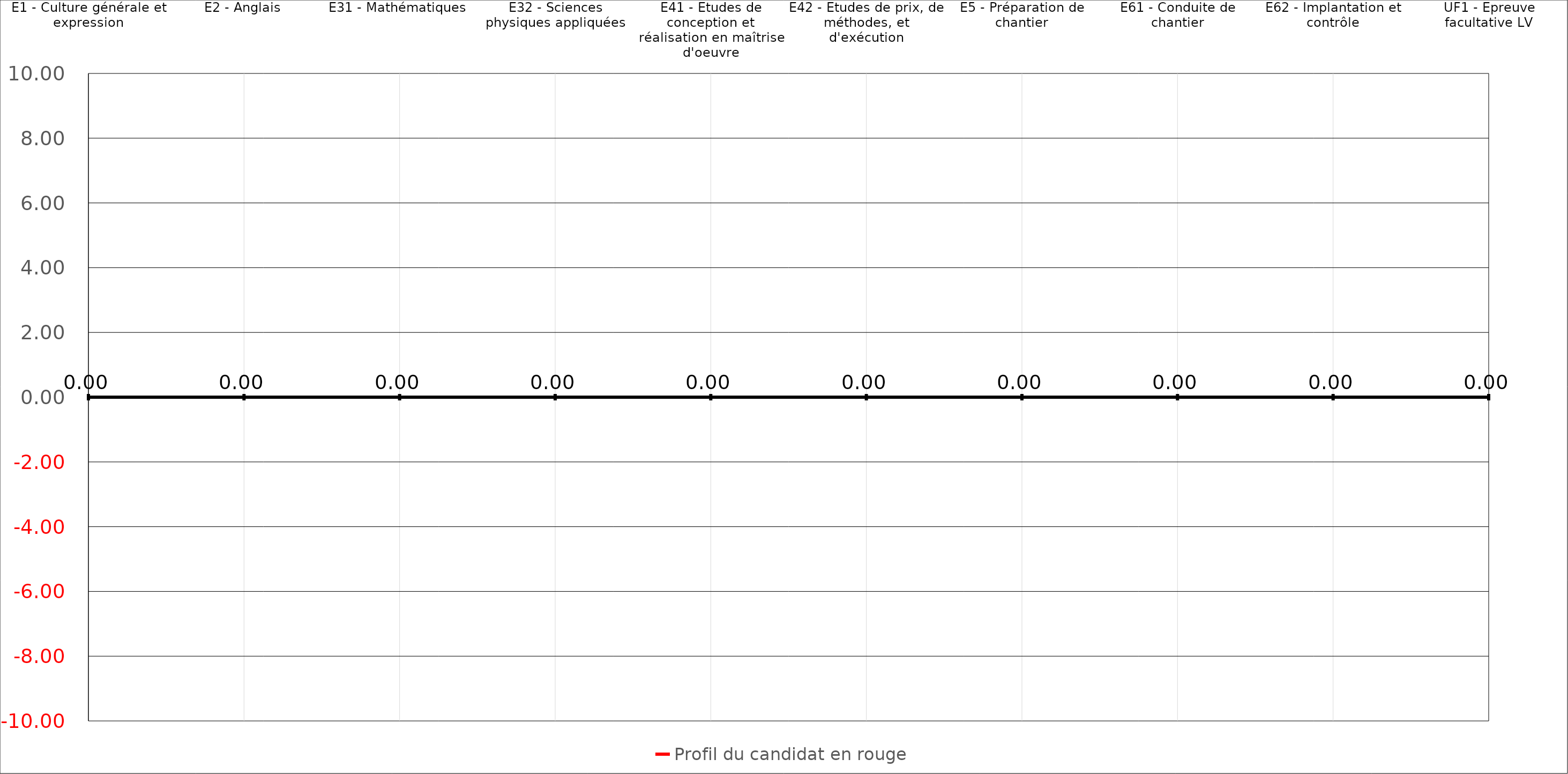
| Category | Profil du candidat en rouge |
|---|---|
| E1 - Culture générale et expression | 0 |
| E2 - Anglais | 0 |
| E31 - Mathématiques | 0 |
| E32 - Sciences physiques appliquées | 0 |
| E41 - Etudes de conception et réalisation en maîtrise d'oeuvre | 0 |
| E42 - Etudes de prix, de méthodes, et d'exécution | 0 |
| E5 - Préparation de chantier | 0 |
| E61 - Conduite de chantier | 0 |
| E62 - Implantation et contrôle | 0 |
| UF1 - Epreuve facultative LV | 0 |